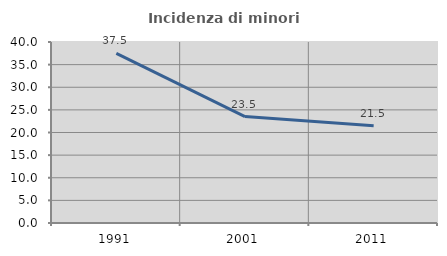
| Category | Incidenza di minori stranieri |
|---|---|
| 1991.0 | 37.5 |
| 2001.0 | 23.529 |
| 2011.0 | 21.481 |